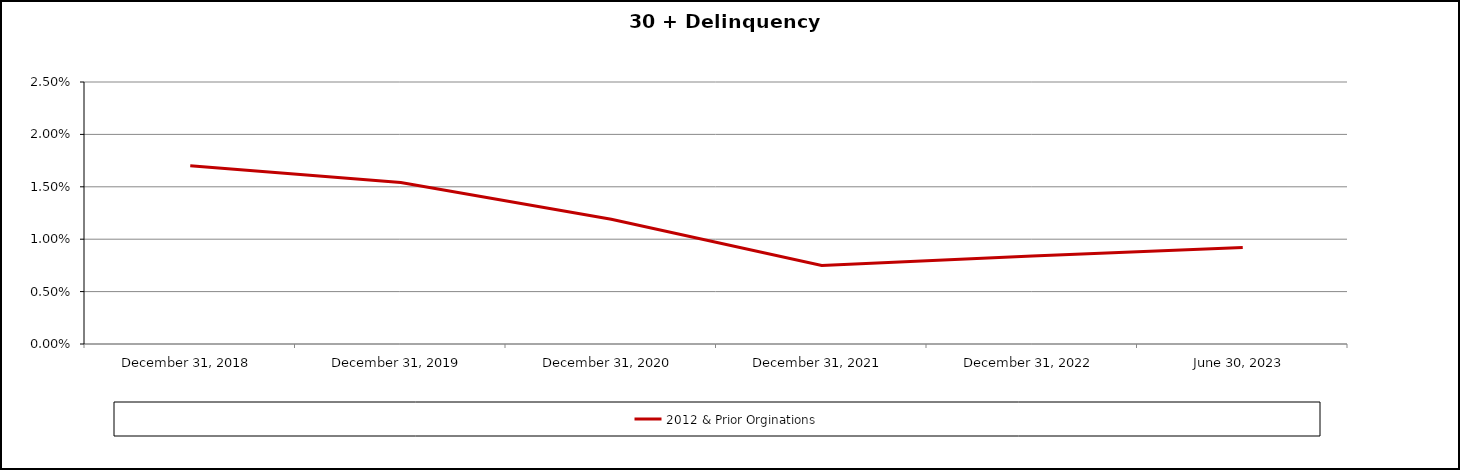
| Category | 2012 & Prior Orginations |
|---|---|
| 2018-12-31 | 0.017 |
| 2019-12-31 | 0.015 |
| 2020-12-31 | 0.012 |
| 2021-12-31 | 0.008 |
| 2022-12-31 | 0.008 |
| 2023-06-30 | 0.009 |